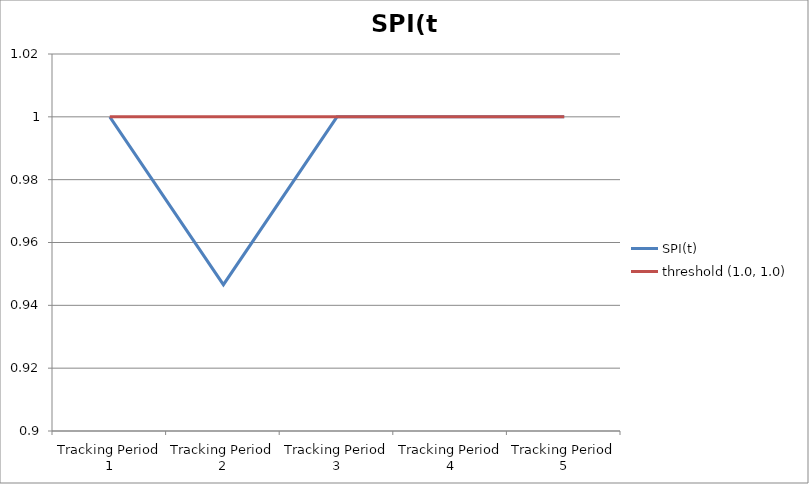
| Category | SPI(t) | threshold (1.0, 1.0) |
|---|---|---|
| Tracking Period 1 | 1 | 1 |
| Tracking Period 2 | 0.947 | 1 |
| Tracking Period 3 | 1 | 1 |
| Tracking Period 4 | 1 | 1 |
| Tracking Period 5 | 1 | 1 |